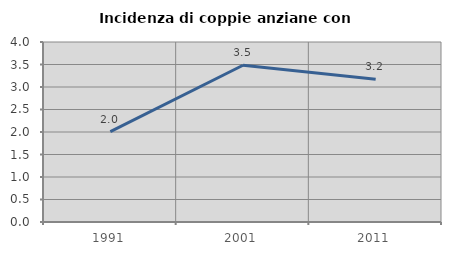
| Category | Incidenza di coppie anziane con figli |
|---|---|
| 1991.0 | 2.008 |
| 2001.0 | 3.484 |
| 2011.0 | 3.171 |